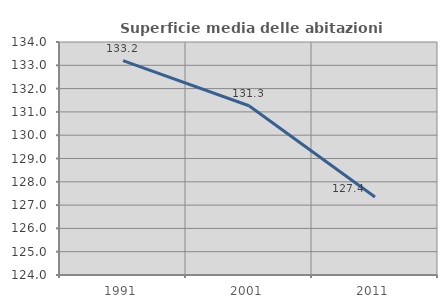
| Category | Superficie media delle abitazioni occupate |
|---|---|
| 1991.0 | 133.199 |
| 2001.0 | 131.263 |
| 2011.0 | 127.351 |